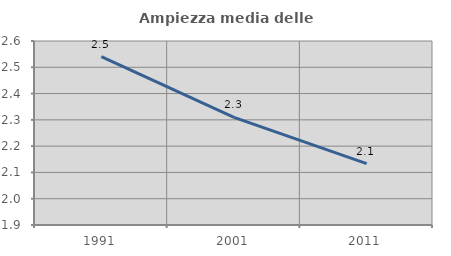
| Category | Ampiezza media delle famiglie |
|---|---|
| 1991.0 | 2.541 |
| 2001.0 | 2.309 |
| 2011.0 | 2.134 |